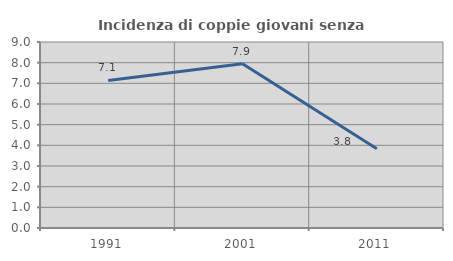
| Category | Incidenza di coppie giovani senza figli |
|---|---|
| 1991.0 | 7.139 |
| 2001.0 | 7.946 |
| 2011.0 | 3.83 |